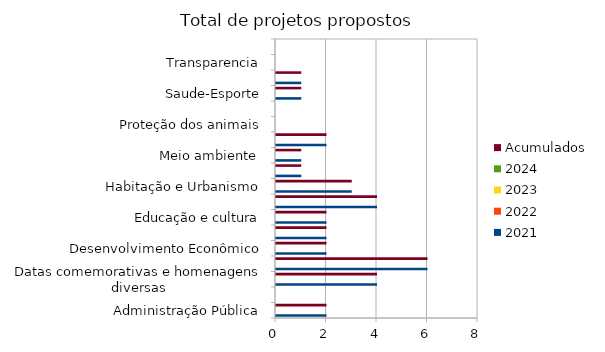
| Category | 2021 | 2022 | 2023 | 2024 | Acumulados |
|---|---|---|---|---|---|
| Administração Pública | 2 |  |  |  | 2 |
| Combate à corrupção  | 0 |  |  |  | 0 |
| Datas comemorativas e homenagens diversas | 4 |  |  |  | 4 |
| Denominação de logradouro | 6 |  |  |  | 6 |
| Desenvolvimento Econômico | 2 |  |  |  | 2 |
| Desenvolvimento Social  | 2 |  |  |  | 2 |
| Educação e cultura | 2 |  |  |  | 2 |
| Frente parlamentar | 4 |  |  |  | 4 |
| Habitação e Urbanismo | 3 |  |  |  | 3 |
| Lei Orgânica do Município | 1 |  |  |  | 1 |
| Meio ambiente  | 1 |  |  |  | 1 |
| Mobilidade | 2 |  |  |  | 2 |
| Proteção dos animais | 0 |  |  |  | 0 |
| Regimento Interno da CMSP | 0 |  |  |  | 0 |
| Saude-Esporte | 1 |  |  |  | 1 |
| Segurança Pública | 1 |  |  |  | 1 |
| Transparencia | 0 |  |  |  | 0 |
| Tributação | 0 |  |  |  | 0 |